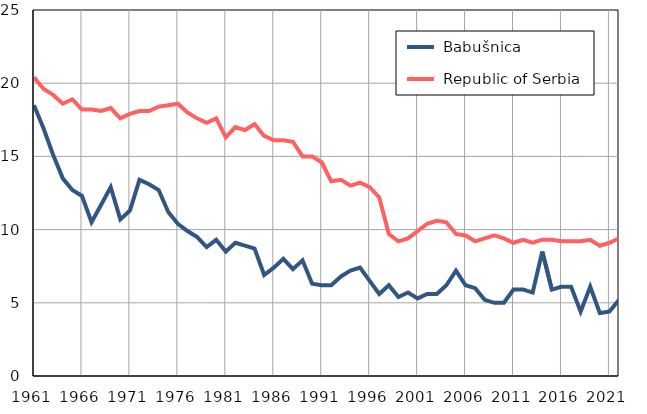
| Category |  Babušnica |  Republic of Serbia |
|---|---|---|
| 1961.0 | 18.5 | 20.4 |
| 1962.0 | 16.9 | 19.6 |
| 1963.0 | 15.1 | 19.2 |
| 1964.0 | 13.5 | 18.6 |
| 1965.0 | 12.7 | 18.9 |
| 1966.0 | 12.3 | 18.2 |
| 1967.0 | 10.5 | 18.2 |
| 1968.0 | 11.7 | 18.1 |
| 1969.0 | 12.9 | 18.3 |
| 1970.0 | 10.7 | 17.6 |
| 1971.0 | 11.3 | 17.9 |
| 1972.0 | 13.4 | 18.1 |
| 1973.0 | 13.1 | 18.1 |
| 1974.0 | 12.7 | 18.4 |
| 1975.0 | 11.2 | 18.5 |
| 1976.0 | 10.4 | 18.6 |
| 1977.0 | 9.9 | 18 |
| 1978.0 | 9.5 | 17.6 |
| 1979.0 | 8.8 | 17.3 |
| 1980.0 | 9.3 | 17.6 |
| 1981.0 | 8.5 | 16.3 |
| 1982.0 | 9.1 | 17 |
| 1983.0 | 8.9 | 16.8 |
| 1984.0 | 8.7 | 17.2 |
| 1985.0 | 6.9 | 16.4 |
| 1986.0 | 7.4 | 16.1 |
| 1987.0 | 8 | 16.1 |
| 1988.0 | 7.3 | 16 |
| 1989.0 | 7.9 | 15 |
| 1990.0 | 6.3 | 15 |
| 1991.0 | 6.2 | 14.6 |
| 1992.0 | 6.2 | 13.3 |
| 1993.0 | 6.8 | 13.4 |
| 1994.0 | 7.2 | 13 |
| 1995.0 | 7.4 | 13.2 |
| 1996.0 | 6.5 | 12.9 |
| 1997.0 | 5.6 | 12.2 |
| 1998.0 | 6.2 | 9.7 |
| 1999.0 | 5.4 | 9.2 |
| 2000.0 | 5.7 | 9.4 |
| 2001.0 | 5.3 | 9.9 |
| 2002.0 | 5.6 | 10.4 |
| 2003.0 | 5.6 | 10.6 |
| 2004.0 | 6.2 | 10.5 |
| 2005.0 | 7.2 | 9.7 |
| 2006.0 | 6.2 | 9.6 |
| 2007.0 | 6 | 9.2 |
| 2008.0 | 5.2 | 9.4 |
| 2009.0 | 5 | 9.6 |
| 2010.0 | 5 | 9.4 |
| 2011.0 | 5.9 | 9.1 |
| 2012.0 | 5.9 | 9.3 |
| 2013.0 | 5.7 | 9.1 |
| 2014.0 | 8.5 | 9.3 |
| 2015.0 | 5.9 | 9.3 |
| 2016.0 | 6.1 | 9.2 |
| 2017.0 | 6.1 | 9.2 |
| 2018.0 | 4.4 | 9.2 |
| 2019.0 | 6.1 | 9.3 |
| 2020.0 | 4.3 | 8.9 |
| 2021.0 | 4.4 | 9.1 |
| 2022.0 | 5.2 | 9.4 |